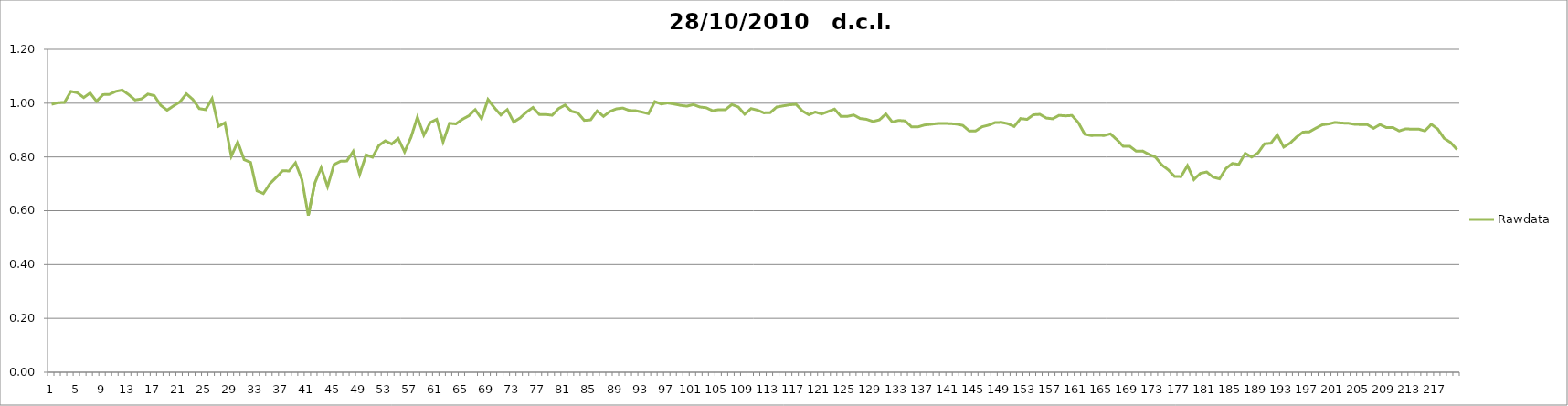
| Category | Rawdata |
|---|---|
| 0 | 0.996 |
| 1 | 1.002 |
| 2 | 1.003 |
| 3 | 1.044 |
| 4 | 1.039 |
| 5 | 1.021 |
| 6 | 1.038 |
| 7 | 1.007 |
| 8 | 1.032 |
| 9 | 1.033 |
| 10 | 1.044 |
| 11 | 1.049 |
| 12 | 1.032 |
| 13 | 1.012 |
| 14 | 1.016 |
| 15 | 1.034 |
| 16 | 1.028 |
| 17 | 0.992 |
| 18 | 0.974 |
| 19 | 0.99 |
| 20 | 1.005 |
| 21 | 1.035 |
| 22 | 1.014 |
| 23 | 0.98 |
| 24 | 0.976 |
| 25 | 1.017 |
| 26 | 0.914 |
| 27 | 0.927 |
| 28 | 0.803 |
| 29 | 0.856 |
| 30 | 0.79 |
| 31 | 0.78 |
| 32 | 0.674 |
| 33 | 0.664 |
| 34 | 0.7 |
| 35 | 0.724 |
| 36 | 0.749 |
| 37 | 0.748 |
| 38 | 0.778 |
| 39 | 0.716 |
| 40 | 0.582 |
| 41 | 0.702 |
| 42 | 0.76 |
| 43 | 0.69 |
| 44 | 0.772 |
| 45 | 0.784 |
| 46 | 0.785 |
| 47 | 0.821 |
| 48 | 0.735 |
| 49 | 0.808 |
| 50 | 0.799 |
| 51 | 0.843 |
| 52 | 0.86 |
| 53 | 0.848 |
| 54 | 0.869 |
| 55 | 0.819 |
| 56 | 0.873 |
| 57 | 0.948 |
| 58 | 0.881 |
| 59 | 0.928 |
| 60 | 0.94 |
| 61 | 0.856 |
| 62 | 0.925 |
| 63 | 0.923 |
| 64 | 0.94 |
| 65 | 0.953 |
| 66 | 0.976 |
| 67 | 0.942 |
| 68 | 1.014 |
| 69 | 0.983 |
| 70 | 0.956 |
| 71 | 0.976 |
| 72 | 0.93 |
| 73 | 0.945 |
| 74 | 0.967 |
| 75 | 0.984 |
| 76 | 0.958 |
| 77 | 0.958 |
| 78 | 0.955 |
| 79 | 0.98 |
| 80 | 0.993 |
| 81 | 0.97 |
| 82 | 0.964 |
| 83 | 0.936 |
| 84 | 0.938 |
| 85 | 0.971 |
| 86 | 0.951 |
| 87 | 0.969 |
| 88 | 0.979 |
| 89 | 0.982 |
| 90 | 0.973 |
| 91 | 0.972 |
| 92 | 0.967 |
| 93 | 0.961 |
| 94 | 1.006 |
| 95 | 0.997 |
| 96 | 1.001 |
| 97 | 0.997 |
| 98 | 0.992 |
| 99 | 0.989 |
| 100 | 0.995 |
| 101 | 0.986 |
| 102 | 0.983 |
| 103 | 0.972 |
| 104 | 0.976 |
| 105 | 0.976 |
| 106 | 0.995 |
| 107 | 0.986 |
| 108 | 0.959 |
| 109 | 0.98 |
| 110 | 0.974 |
| 111 | 0.964 |
| 112 | 0.965 |
| 113 | 0.986 |
| 114 | 0.99 |
| 115 | 0.994 |
| 116 | 0.996 |
| 117 | 0.971 |
| 118 | 0.957 |
| 119 | 0.967 |
| 120 | 0.96 |
| 121 | 0.969 |
| 122 | 0.978 |
| 123 | 0.951 |
| 124 | 0.951 |
| 125 | 0.956 |
| 126 | 0.943 |
| 127 | 0.94 |
| 128 | 0.932 |
| 129 | 0.938 |
| 130 | 0.96 |
| 131 | 0.93 |
| 132 | 0.936 |
| 133 | 0.934 |
| 134 | 0.912 |
| 135 | 0.912 |
| 136 | 0.919 |
| 137 | 0.922 |
| 138 | 0.924 |
| 139 | 0.925 |
| 140 | 0.924 |
| 141 | 0.922 |
| 142 | 0.917 |
| 143 | 0.897 |
| 144 | 0.897 |
| 145 | 0.912 |
| 146 | 0.918 |
| 147 | 0.928 |
| 148 | 0.929 |
| 149 | 0.924 |
| 150 | 0.913 |
| 151 | 0.943 |
| 152 | 0.94 |
| 153 | 0.957 |
| 154 | 0.958 |
| 155 | 0.945 |
| 156 | 0.942 |
| 157 | 0.955 |
| 158 | 0.953 |
| 159 | 0.954 |
| 160 | 0.928 |
| 161 | 0.884 |
| 162 | 0.88 |
| 163 | 0.881 |
| 164 | 0.88 |
| 165 | 0.886 |
| 166 | 0.864 |
| 167 | 0.84 |
| 168 | 0.84 |
| 169 | 0.822 |
| 170 | 0.822 |
| 171 | 0.81 |
| 172 | 0.8 |
| 173 | 0.77 |
| 174 | 0.752 |
| 175 | 0.727 |
| 176 | 0.727 |
| 177 | 0.768 |
| 178 | 0.716 |
| 179 | 0.739 |
| 180 | 0.744 |
| 181 | 0.725 |
| 182 | 0.719 |
| 183 | 0.757 |
| 184 | 0.776 |
| 185 | 0.772 |
| 186 | 0.813 |
| 187 | 0.8 |
| 188 | 0.815 |
| 189 | 0.849 |
| 190 | 0.851 |
| 191 | 0.882 |
| 192 | 0.837 |
| 193 | 0.851 |
| 194 | 0.874 |
| 195 | 0.893 |
| 196 | 0.894 |
| 197 | 0.907 |
| 198 | 0.92 |
| 199 | 0.923 |
| 200 | 0.928 |
| 201 | 0.926 |
| 202 | 0.926 |
| 203 | 0.922 |
| 204 | 0.92 |
| 205 | 0.92 |
| 206 | 0.906 |
| 207 | 0.92 |
| 208 | 0.909 |
| 209 | 0.91 |
| 210 | 0.897 |
| 211 | 0.904 |
| 212 | 0.903 |
| 213 | 0.904 |
| 214 | 0.897 |
| 215 | 0.922 |
| 216 | 0.904 |
| 217 | 0.869 |
| 218 | 0.854 |
| 219 | 0.827 |